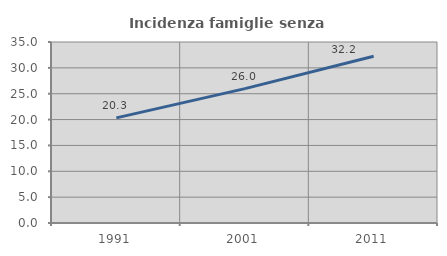
| Category | Incidenza famiglie senza nuclei |
|---|---|
| 1991.0 | 20.33 |
| 2001.0 | 25.984 |
| 2011.0 | 32.235 |